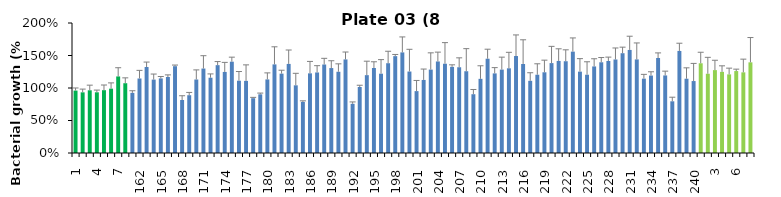
| Category | 8 h % |
|---|---|
| 1.0 | 0.96 |
| 2.0 | 0.933 |
| 3.0 | 0.965 |
| 4.0 | 0.934 |
| 5.0 | 0.966 |
| 6.0 | 0.99 |
| 7.0 | 1.178 |
| 8.0 | 1.074 |
| 161.0 | 0.925 |
| 162.0 | 1.146 |
| 163.0 | 1.323 |
| 164.0 | 1.129 |
| 165.0 | 1.147 |
| 166.0 | 1.169 |
| 167.0 | 1.335 |
| 168.0 | 0.815 |
| 169.0 | 0.889 |
| 170.0 | 1.131 |
| 171.0 | 1.299 |
| 172.0 | 1.158 |
| 173.0 | 1.352 |
| 174.0 | 1.247 |
| 175.0 | 1.405 |
| 176.0 | 1.112 |
| 177.0 | 1.11 |
| 178.0 | 0.843 |
| 179.0 | 0.903 |
| 180.0 | 1.132 |
| 181.0 | 1.363 |
| 182.0 | 1.221 |
| 183.0 | 1.371 |
| 184.0 | 1.041 |
| 185.0 | 0.786 |
| 186.0 | 1.226 |
| 187.0 | 1.239 |
| 188.0 | 1.362 |
| 189.0 | 1.307 |
| 190.0 | 1.25 |
| 191.0 | 1.44 |
| 192.0 | 0.757 |
| 193.0 | 1.015 |
| 194.0 | 1.198 |
| 195.0 | 1.308 |
| 196.0 | 1.22 |
| 197.0 | 1.381 |
| 198.0 | 1.49 |
| 199.0 | 1.548 |
| 200.0 | 1.254 |
| 201.0 | 0.952 |
| 202.0 | 1.124 |
| 203.0 | 1.283 |
| 204.0 | 1.408 |
| 205.0 | 1.373 |
| 206.0 | 1.326 |
| 207.0 | 1.319 |
| 208.0 | 1.258 |
| 209.0 | 0.904 |
| 210.0 | 1.141 |
| 211.0 | 1.451 |
| 212.0 | 1.225 |
| 213.0 | 1.283 |
| 214.0 | 1.303 |
| 215.0 | 1.492 |
| 216.0 | 1.37 |
| 217.0 | 1.11 |
| 218.0 | 1.204 |
| 219.0 | 1.242 |
| 220.0 | 1.383 |
| 221.0 | 1.416 |
| 222.0 | 1.412 |
| 223.0 | 1.56 |
| 224.0 | 1.252 |
| 225.0 | 1.204 |
| 226.0 | 1.332 |
| 227.0 | 1.396 |
| 228.0 | 1.416 |
| 229.0 | 1.439 |
| 230.0 | 1.535 |
| 231.0 | 1.586 |
| 232.0 | 1.44 |
| 233.0 | 1.144 |
| 234.0 | 1.191 |
| 235.0 | 1.461 |
| 236.0 | 1.193 |
| 237.0 | 0.796 |
| 238.0 | 1.57 |
| 239.0 | 1.143 |
| 240.0 | 1.107 |
| 1.0 | 1.38 |
| 2.0 | 1.219 |
| 3.0 | 1.275 |
| 4.0 | 1.248 |
| 5.0 | 1.209 |
| 6.0 | 1.261 |
| 7.0 | 1.241 |
| 8.0 | 1.395 |